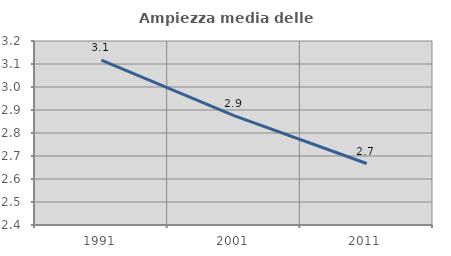
| Category | Ampiezza media delle famiglie |
|---|---|
| 1991.0 | 3.116 |
| 2001.0 | 2.876 |
| 2011.0 | 2.667 |